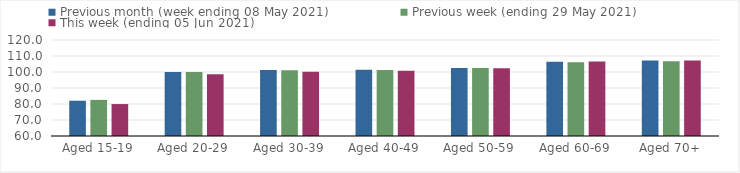
| Category | Previous month (week ending 08 May 2021) | Previous week (ending 29 May 2021) | This week (ending 05 Jun 2021) |
|---|---|---|---|
| Aged 15-19 | 82.05 | 82.56 | 79.96 |
| Aged 20-29 | 100.01 | 100 | 98.64 |
| Aged 30-39 | 101.26 | 101.04 | 100.23 |
| Aged 40-49 | 101.34 | 101.27 | 100.8 |
| Aged 50-59 | 102.57 | 102.45 | 102.33 |
| Aged 60-69 | 106.43 | 106.06 | 106.56 |
| Aged 70+ | 107.18 | 106.74 | 107.25 |